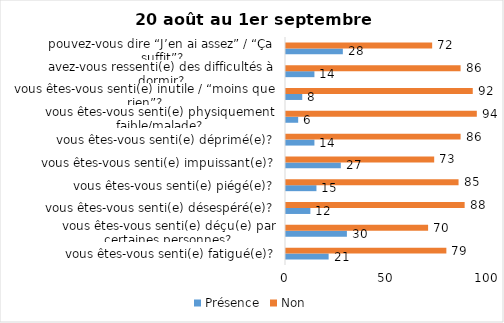
| Category | Présence | Non |
|---|---|---|
| vous êtes-vous senti(e) fatigué(e)? | 21 | 79 |
| vous êtes-vous senti(e) déçu(e) par certaines personnes? | 30 | 70 |
| vous êtes-vous senti(e) désespéré(e)? | 12 | 88 |
| vous êtes-vous senti(e) piégé(e)? | 15 | 85 |
| vous êtes-vous senti(e) impuissant(e)? | 27 | 73 |
| vous êtes-vous senti(e) déprimé(e)? | 14 | 86 |
| vous êtes-vous senti(e) physiquement faible/malade? | 6 | 94 |
| vous êtes-vous senti(e) inutile / “moins que rien”? | 8 | 92 |
| avez-vous ressenti(e) des difficultés à dormir? | 14 | 86 |
| pouvez-vous dire “J’en ai assez” / “Ça suffit”? | 28 | 72 |